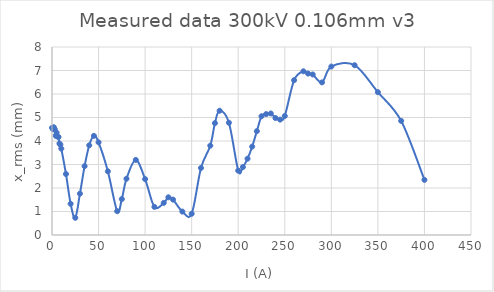
| Category | Series 0 |
|---|---|
| 0.0 | 4.56 |
| 1.0 | 4.505 |
| 2.0 | 4.584 |
| 3.0 | 4.495 |
| 4.0 | 4.22 |
| 5.0 | 4.355 |
| 6.0 | 4.19 |
| 7.0 | 4.167 |
| 8.0 | 3.895 |
| 9.0 | 3.846 |
| 10.0 | 3.676 |
| 15.0 | 2.595 |
| 20.0 | 1.328 |
| 25.0 | 0.732 |
| 30.0 | 1.758 |
| 35.0 | 2.928 |
| 40.0 | 3.817 |
| 45.0 | 4.22 |
| 50.0 | 3.943 |
| 60.0 | 2.711 |
| 70.0 | 1.013 |
| 75.0 | 1.529 |
| 80.0 | 2.394 |
| 90.0 | 3.195 |
| 100.0 | 2.379 |
| 110.0 | 1.196 |
| 120.0 | 1.366 |
| 125.0 | 1.604 |
| 130.0 | 1.505 |
| 140.0 | 0.997 |
| 150.0 | 0.904 |
| 160.0 | 2.852 |
| 170.0 | 3.801 |
| 175.0 | 4.761 |
| 180.0 | 5.288 |
| 190.0 | 4.776 |
| 200.0 | 2.739 |
| 205.0 | 2.891 |
| 210.0 | 3.248 |
| 215.0 | 3.762 |
| 220.0 | 4.418 |
| 225.0 | 5.053 |
| 230.0 | 5.144 |
| 235.0 | 5.171 |
| 240.0 | 4.978 |
| 245.0 | 4.91 |
| 250.0 | 5.063 |
| 260.0 | 6.589 |
| 270.0 | 6.967 |
| 275.0 | 6.87 |
| 280.0 | 6.831 |
| 290.0 | 6.495 |
| 300.0 | 7.168 |
| 325.0 | 7.224 |
| 350.0 | 6.078 |
| 375.0 | 4.855 |
| 400.0 | 2.346 |